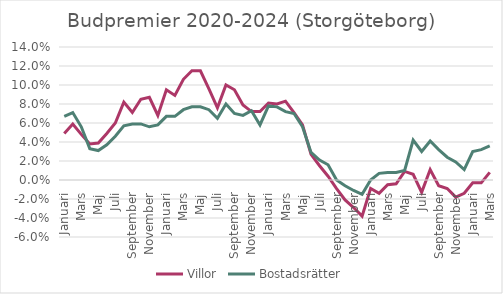
| Category | Villor | Bostadsrätter |
|---|---|---|
| Januari | 0.049 | 0.067 |
| Februari | 0.059 | 0.071 |
| Mars | 0.048 | 0.056 |
| April | 0.038 | 0.033 |
| Maj | 0.039 | 0.031 |
| Juni | 0.049 | 0.037 |
| Juli | 0.06 | 0.046 |
| Augusti | 0.082 | 0.057 |
| September | 0.071 | 0.059 |
| Oktober | 0.085 | 0.059 |
| November | 0.087 | 0.056 |
| December | 0.068 | 0.058 |
| Januari | 0.095 | 0.067 |
| Februari | 0.089 | 0.067 |
| Mars | 0.106 | 0.074 |
| April | 0.115 | 0.077 |
| Maj | 0.115 | 0.077 |
| Juni | 0.096 | 0.074 |
| Juli | 0.076 | 0.065 |
| Augusti | 0.1 | 0.08 |
| September | 0.095 | 0.07 |
| Oktober | 0.079 | 0.068 |
| November | 0.072 | 0.073 |
| December | 0.072 | 0.058 |
| Januari | 0.081 | 0.078 |
| Februari | 0.08 | 0.077 |
| Mars | 0.083 | 0.072 |
| April | 0.071 | 0.07 |
| Maj | 0.058 | 0.056 |
| Juni | 0.027 | 0.029 |
| Juli | 0.015 | 0.021 |
| Augusti | 0.004 | 0.016 |
| September | -0.009 | 0 |
| Oktober | -0.021 | -0.006 |
| November | -0.029 | -0.011 |
| December | -0.038 | -0.015 |
| Januari | -0.009 | 0 |
| Februari | -0.014 | 0.007 |
| Mars | -0.005 | 0.008 |
| April | -0.004 | 0.008 |
| Maj | 0.009 | 0.01 |
| Juni | 0.006 | 0.042 |
| Juli | -0.013 | 0.03 |
| Augusti | 0.011 | 0.041 |
| September | -0.006 | 0.032 |
| Oktober | -0.009 | 0.024 |
| November | -0.018 | 0.019 |
| December | -0.014 | 0.011 |
| Januari | -0.003 | 0.03 |
| Februari | -0.003 | 0.032 |
| Mars | 0.008 | 0.036 |